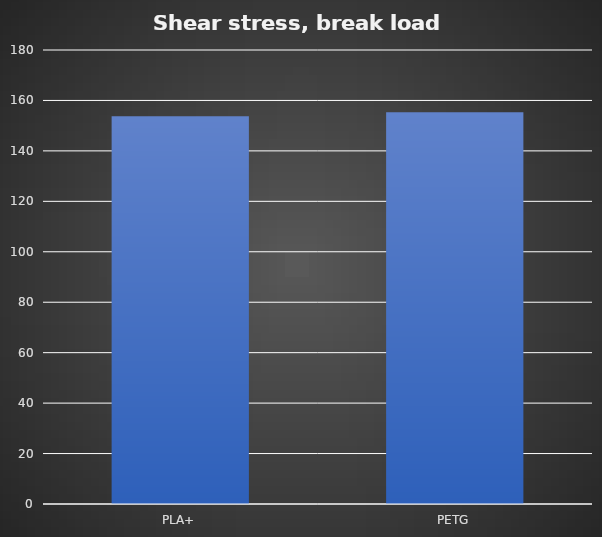
| Category | Break kg |
|---|---|
| PLA+ | 153.7 |
| PETG | 155.3 |